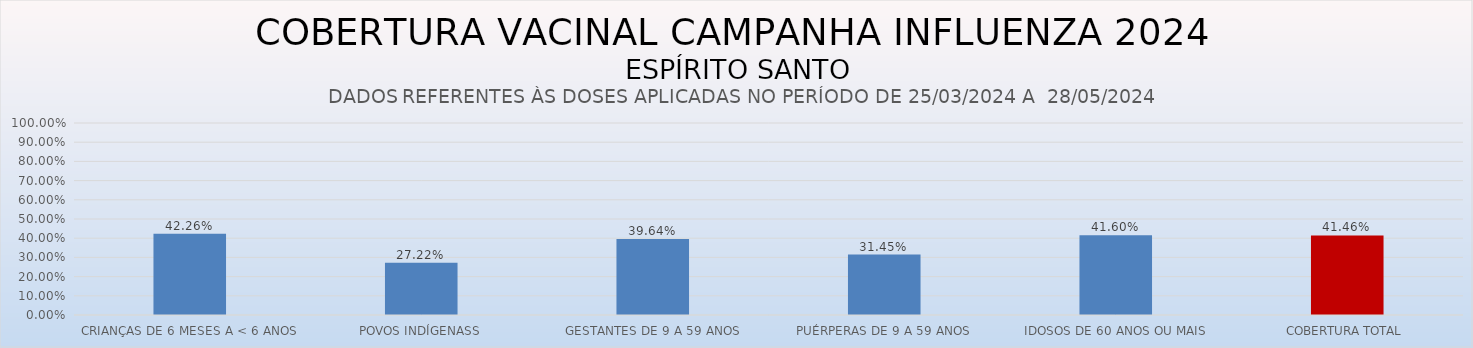
| Category | COBERTURA VACINAL |
|---|---|
| CRIANÇAS DE 6 MESES A < 6 ANOS | 0.423 |
| POVOS INDÍGENASS | 0.272 |
| GESTANTES DE 9 A 59 ANOS | 0.396 |
| PUÉRPERAS DE 9 A 59 ANOS | 0.315 |
| IDOSOS DE 60 ANOS OU MAIS | 0.416 |
| COBERTURA TOTAL | 0.415 |